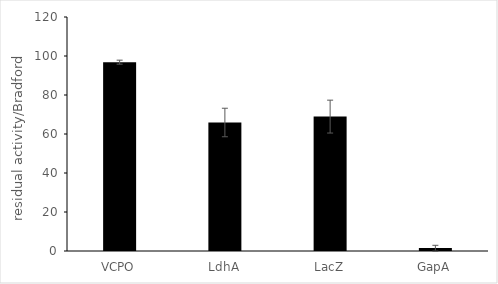
| Category | Series 0 |
|---|---|
| VCPO | 96.84 |
| LdhA | 65.897 |
| LacZ | 68.923 |
| GapA | 1.487 |